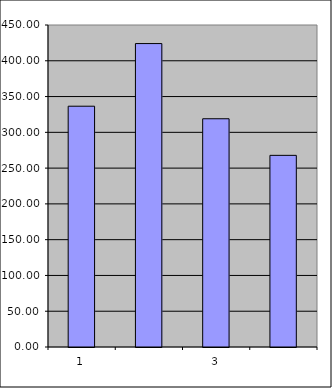
| Category | Series 0 |
|---|---|
| 0 | 336.5 |
| 1 | 424.044 |
| 2 | 318.964 |
| 3 | 267.838 |